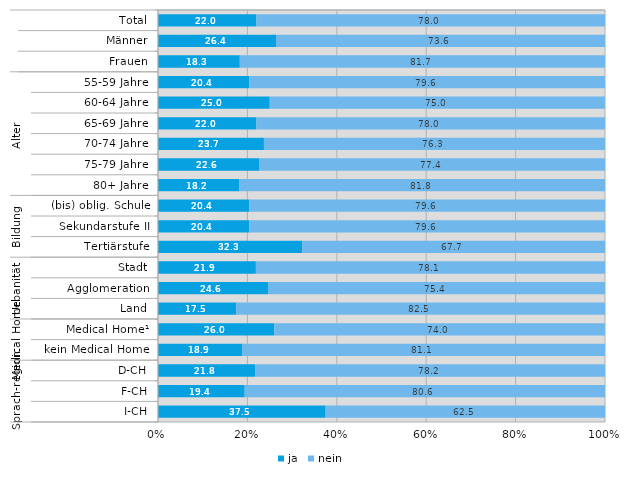
| Category | ja | nein |
|---|---|---|
| 0 | 22 | 78 |
| 1 | 26.4 | 73.6 |
| 2 | 18.3 | 81.7 |
| 3 | 20.4 | 79.6 |
| 4 | 25 | 75 |
| 5 | 22 | 78 |
| 6 | 23.7 | 76.3 |
| 7 | 22.6 | 77.4 |
| 8 | 18.2 | 81.8 |
| 9 | 20.4 | 79.6 |
| 10 | 20.4 | 79.6 |
| 11 | 32.3 | 67.7 |
| 12 | 21.9 | 78.1 |
| 13 | 24.6 | 75.4 |
| 14 | 17.5 | 82.5 |
| 15 | 26 | 74 |
| 16 | 18.9 | 81.1 |
| 17 | 21.8 | 78.2 |
| 18 | 19.4 | 80.6 |
| 19 | 37.5 | 62.5 |